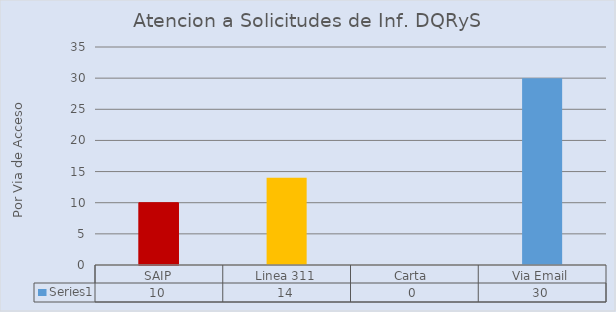
| Category | Series 0 |
|---|---|
| SAIP | 10 |
| Linea 311 | 14 |
| Carta  | 0 |
| Via Email | 30 |